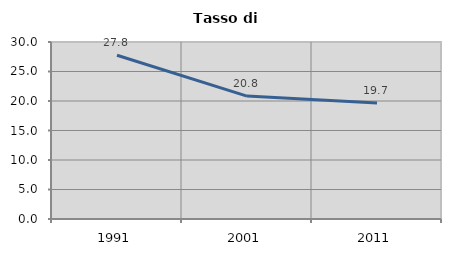
| Category | Tasso di disoccupazione   |
|---|---|
| 1991.0 | 27.753 |
| 2001.0 | 20.831 |
| 2011.0 | 19.663 |